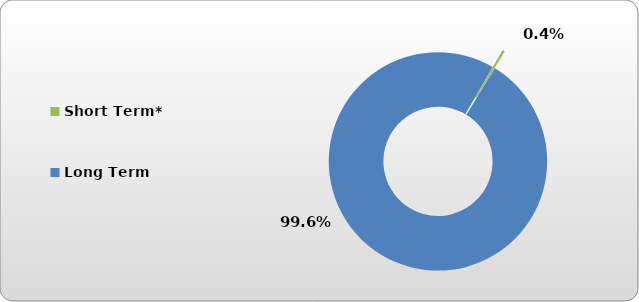
| Category | Short Term* |
|---|---|
| Short Term* | 540.912 |
| Long Term | 145720.744 |